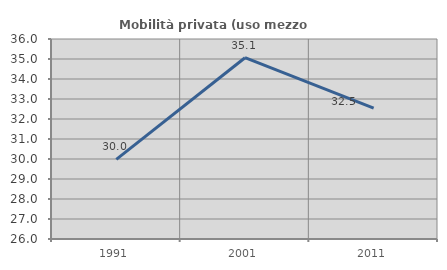
| Category | Mobilità privata (uso mezzo privato) |
|---|---|
| 1991.0 | 29.981 |
| 2001.0 | 35.065 |
| 2011.0 | 32.546 |